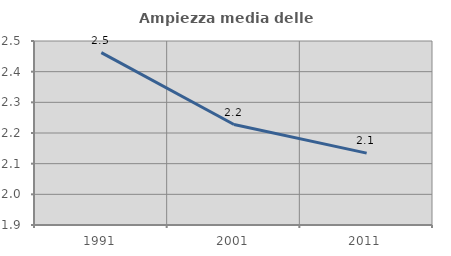
| Category | Ampiezza media delle famiglie |
|---|---|
| 1991.0 | 2.462 |
| 2001.0 | 2.228 |
| 2011.0 | 2.134 |